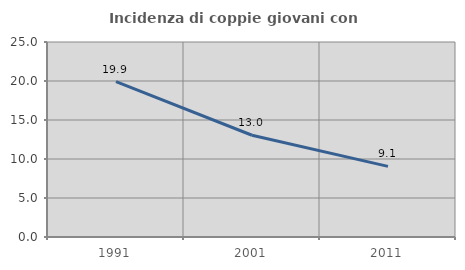
| Category | Incidenza di coppie giovani con figli |
|---|---|
| 1991.0 | 19.915 |
| 2001.0 | 13.046 |
| 2011.0 | 9.052 |